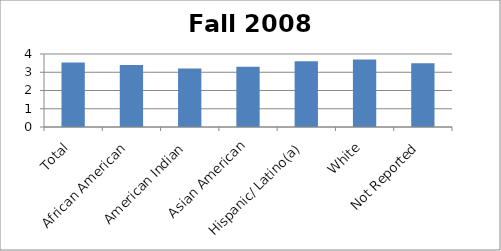
| Category | Fall 2008 GPA |
|---|---|
| Total | 3.538 |
| African American | 3.4 |
| American Indian | 3.2 |
| Asian American | 3.3 |
| Hispanic/ Latino(a) | 3.6 |
| White | 3.7 |
| Not Reported | 3.5 |